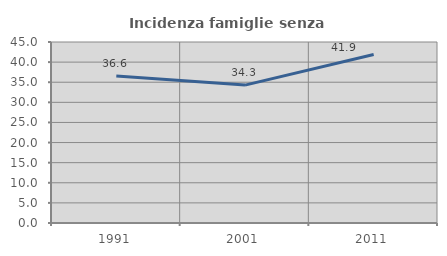
| Category | Incidenza famiglie senza nuclei |
|---|---|
| 1991.0 | 36.552 |
| 2001.0 | 34.286 |
| 2011.0 | 41.912 |